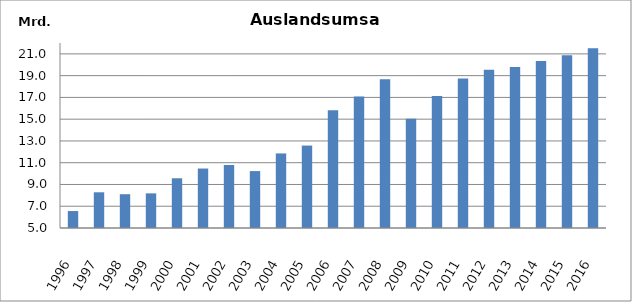
| Category | Series 0 |
|---|---|
| 1996.0 | 6557769 |
| 1997.0 | 8280764 |
| 1998.0 | 8105464 |
| 1999.0 | 8182730 |
| 2000.0 | 9569050 |
| 2001.0 | 10464574 |
| 2002.0 | 10788499 |
| 2003.0 | 10230107 |
| 2004.0 | 11851867 |
| 2005.0 | 12574466 |
| 2006.0 | 15829050 |
| 2007.0 | 17072669 |
| 2008.0 | 18677331 |
| 2009.0 | 15048748 |
| 2010.0 | 17119030.883 |
| 2011.0 | 18748015 |
| 2012.0 | 19537292 |
| 2013.0 | 19797360.276 |
| 2014.0 | 20348090.799 |
| 2015.0 | 20863282 |
| 2016.0 | 21526064 |